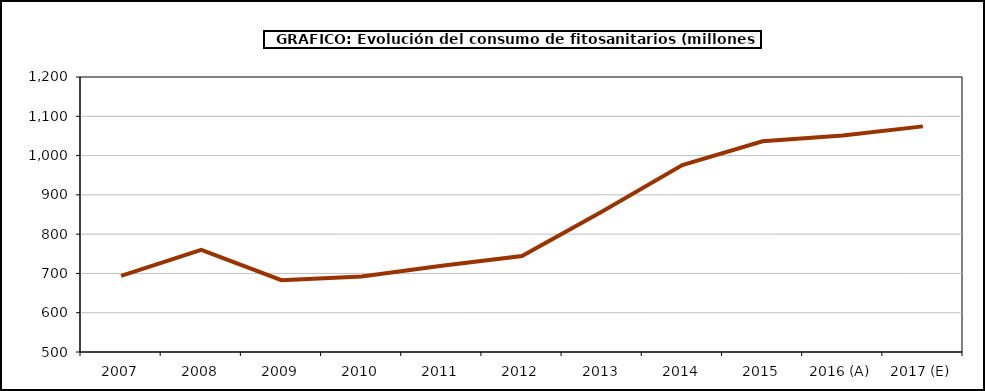
| Category | fitosanitarios |
|---|---|
| 2007 | 693.603 |
| 2008 | 760.166 |
| 2009 | 682.842 |
| 2010 | 692.238 |
| 2011 | 719.583 |
| 2012 | 744.231 |
| 2013 | 857.443 |
| 2014 | 975.802 |
| 2015 | 1036.274 |
| 2016 (A) | 1050.938 |
| 2017 (E) | 1074.339 |